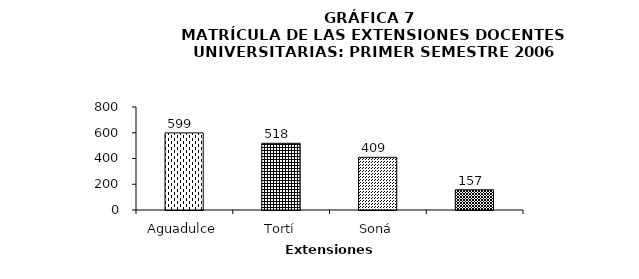
| Category | Series 0 |
|---|---|
| Aguadulce | 599 |
| Tortí | 518 |
| Soná | 409 |